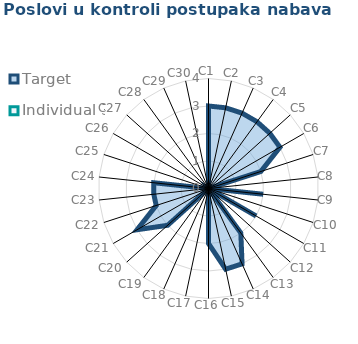
| Category | Target | Individual 3 |
|---|---|---|
| C1 | 3 | 0 |
| C2 | 3 | 0 |
| C3 | 3 | 0 |
| C4 | 3 | 0 |
| C5 | 3 | 0 |
| C6 | 3 | 0 |
| C7 | 2 | 0 |
| C8 | 0 | 0 |
| C9 | 2 | 0 |
| C10 | 0 | 0 |
| C11 | 2 | 0 |
| C12 | 0 | 0 |
| C13 | 2 | 0 |
| C14 | 3 | 0 |
| C15 | 3 | 0 |
| C16 | 2 | 0 |
| C17 | 0 | 0 |
| C18 | 0 | 0 |
| C19 | 0 | 0 |
| C20 | 2 | 0 |
| C21 | 3 | 0 |
| C22 | 2 | 0 |
| C23 | 2 | 0 |
| C24 | 2 | 0 |
| C25 | 0 | 0 |
| C26 | 0 | 0 |
| C27 | 0 | 0 |
| C28 | 0 | 0 |
| C29 | 0 | 0 |
| C30 | 0 | 0 |